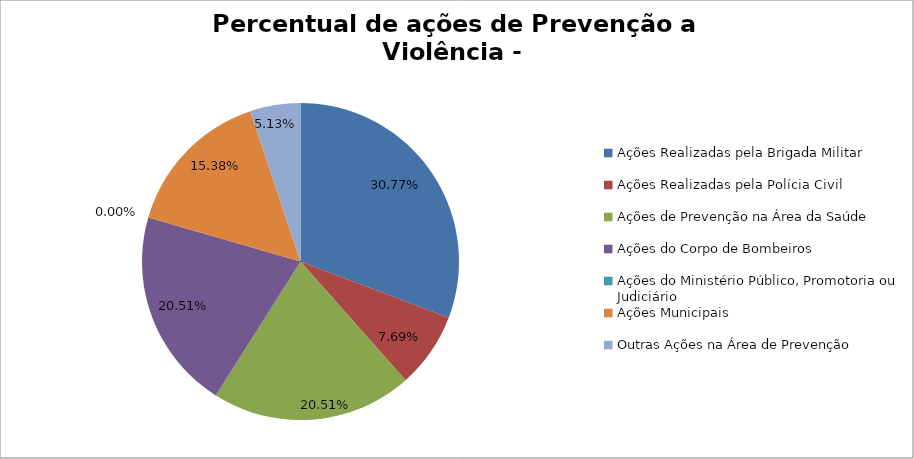
| Category | Percentual |
|---|---|
| Ações Realizadas pela Brigada Militar | 0.308 |
| Ações Realizadas pela Polícia Civil | 0.077 |
| Ações de Prevenção na Área da Saúde | 0.205 |
| Ações do Corpo de Bombeiros | 0.205 |
| Ações do Ministério Público, Promotoria ou Judiciário | 0 |
| Ações Municipais | 0.154 |
| Outras Ações na Área de Prevenção | 0.051 |